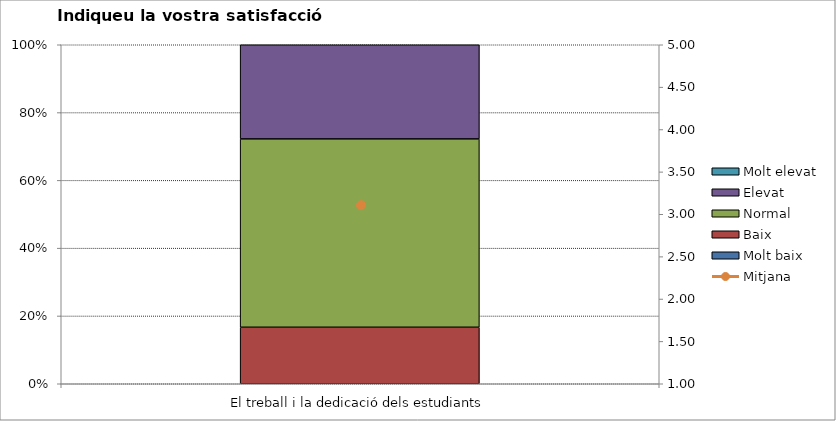
| Category | Molt baix | Baix | Normal  | Elevat | Molt elevat |
|---|---|---|---|---|---|
| El treball i la dedicació dels estudiants | 0 | 3 | 10 | 5 | 0 |